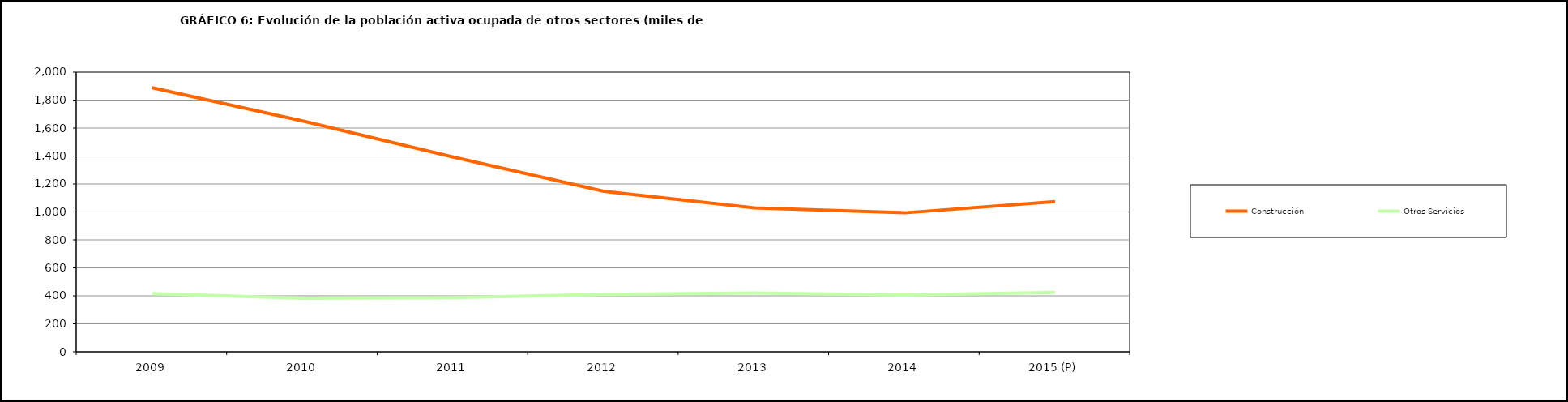
| Category | Construcción | Otros Servicios |
|---|---|---|
| 2009 | 1888.275 | 416.175 |
| 2010 | 1650.825 | 382 |
| 2011 | 1392.95 | 387.25 |
| 2012 | 1147.575 | 410.85 |
| 2013 | 1029.6 | 419.6 |
| 2014 | 993.5 | 405.475 |
| 2015 (P) | 1073.65 | 424.325 |